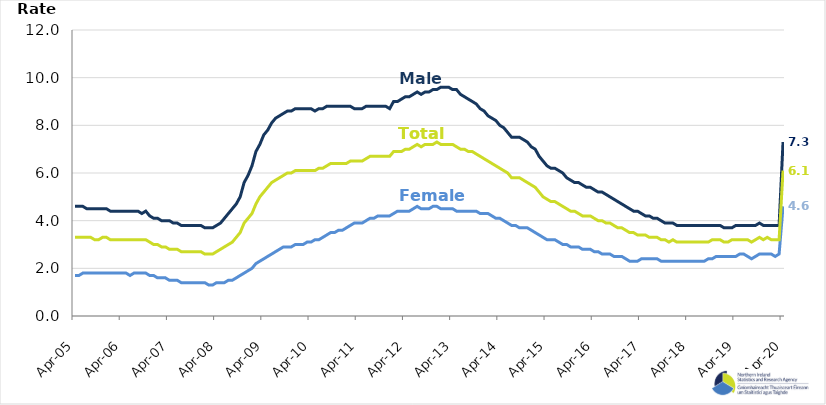
| Category | Male | Female | Total |
|---|---|---|---|
| 2005-04-01 | 4.6 | 1.7 | 3.3 |
| 2005-05-01 | 4.6 | 1.7 | 3.3 |
| 2005-06-01 | 4.6 | 1.8 | 3.3 |
| 2005-07-01 | 4.5 | 1.8 | 3.3 |
| 2005-08-01 | 4.5 | 1.8 | 3.3 |
| 2005-09-01 | 4.5 | 1.8 | 3.2 |
| 2005-10-01 | 4.5 | 1.8 | 3.2 |
| 2005-11-01 | 4.5 | 1.8 | 3.3 |
| 2005-12-01 | 4.5 | 1.8 | 3.3 |
| 2006-01-01 | 4.4 | 1.8 | 3.2 |
| 2006-02-01 | 4.4 | 1.8 | 3.2 |
| 2006-03-01 | 4.4 | 1.8 | 3.2 |
| 2006-04-01 | 4.4 | 1.8 | 3.2 |
| 2006-05-01 | 4.4 | 1.8 | 3.2 |
| 2006-06-01 | 4.4 | 1.7 | 3.2 |
| 2006-07-01 | 4.4 | 1.8 | 3.2 |
| 2006-08-01 | 4.4 | 1.8 | 3.2 |
| 2006-09-01 | 4.3 | 1.8 | 3.2 |
| 2006-10-01 | 4.4 | 1.8 | 3.2 |
| 2006-11-01 | 4.2 | 1.7 | 3.1 |
| 2006-12-01 | 4.1 | 1.7 | 3 |
| 2007-01-01 | 4.1 | 1.6 | 3 |
| 2007-02-01 | 4 | 1.6 | 2.9 |
| 2007-03-01 | 4 | 1.6 | 2.9 |
| 2007-04-01 | 4 | 1.5 | 2.8 |
| 2007-05-01 | 3.9 | 1.5 | 2.8 |
| 2007-06-01 | 3.9 | 1.5 | 2.8 |
| 2007-07-01 | 3.8 | 1.4 | 2.7 |
| 2007-08-01 | 3.8 | 1.4 | 2.7 |
| 2007-09-01 | 3.8 | 1.4 | 2.7 |
| 2007-10-01 | 3.8 | 1.4 | 2.7 |
| 2007-11-01 | 3.8 | 1.4 | 2.7 |
| 2007-12-01 | 3.8 | 1.4 | 2.7 |
| 2008-01-01 | 3.7 | 1.4 | 2.6 |
| 2008-02-01 | 3.7 | 1.3 | 2.6 |
| 2008-03-01 | 3.7 | 1.3 | 2.6 |
| 2008-04-01 | 3.8 | 1.4 | 2.7 |
| 2008-05-01 | 3.9 | 1.4 | 2.8 |
| 2008-06-01 | 4.1 | 1.4 | 2.9 |
| 2008-07-01 | 4.3 | 1.5 | 3 |
| 2008-08-01 | 4.5 | 1.5 | 3.1 |
| 2008-09-01 | 4.7 | 1.6 | 3.3 |
| 2008-10-01 | 5 | 1.7 | 3.5 |
| 2008-11-01 | 5.6 | 1.8 | 3.9 |
| 2008-12-01 | 5.9 | 1.9 | 4.1 |
| 2009-01-01 | 6.3 | 2 | 4.3 |
| 2009-02-01 | 6.9 | 2.2 | 4.7 |
| 2009-03-01 | 7.2 | 2.3 | 5 |
| 2009-04-01 | 7.6 | 2.4 | 5.2 |
| 2009-05-01 | 7.8 | 2.5 | 5.4 |
| 2009-06-01 | 8.1 | 2.6 | 5.6 |
| 2009-07-01 | 8.3 | 2.7 | 5.7 |
| 2009-08-01 | 8.4 | 2.8 | 5.8 |
| 2009-09-01 | 8.5 | 2.9 | 5.9 |
| 2009-10-01 | 8.6 | 2.9 | 6 |
| 2009-11-01 | 8.6 | 2.9 | 6 |
| 2009-12-01 | 8.7 | 3 | 6.1 |
| 2010-01-01 | 8.7 | 3 | 6.1 |
| 2010-02-01 | 8.7 | 3 | 6.1 |
| 2010-03-01 | 8.7 | 3.1 | 6.1 |
| 2010-04-01 | 8.7 | 3.1 | 6.1 |
| 2010-05-01 | 8.6 | 3.2 | 6.1 |
| 2010-06-01 | 8.7 | 3.2 | 6.2 |
| 2010-07-01 | 8.7 | 3.3 | 6.2 |
| 2010-08-01 | 8.8 | 3.4 | 6.3 |
| 2010-09-01 | 8.8 | 3.5 | 6.4 |
| 2010-10-01 | 8.8 | 3.5 | 6.4 |
| 2010-11-01 | 8.8 | 3.6 | 6.4 |
| 2010-12-01 | 8.8 | 3.6 | 6.4 |
| 2011-01-01 | 8.8 | 3.7 | 6.4 |
| 2011-02-01 | 8.8 | 3.8 | 6.5 |
| 2011-03-01 | 8.7 | 3.9 | 6.5 |
| 2011-04-01 | 8.7 | 3.9 | 6.5 |
| 2011-05-01 | 8.7 | 3.9 | 6.5 |
| 2011-06-01 | 8.8 | 4 | 6.6 |
| 2011-07-01 | 8.8 | 4.1 | 6.7 |
| 2011-08-01 | 8.8 | 4.1 | 6.7 |
| 2011-09-01 | 8.8 | 4.2 | 6.7 |
| 2011-10-01 | 8.8 | 4.2 | 6.7 |
| 2011-11-01 | 8.8 | 4.2 | 6.7 |
| 2011-12-01 | 8.7 | 4.2 | 6.7 |
| 2012-01-01 | 9 | 4.3 | 6.9 |
| 2012-02-01 | 9 | 4.4 | 6.9 |
| 2012-03-01 | 9.1 | 4.4 | 6.9 |
| 2012-04-01 | 9.2 | 4.4 | 7 |
| 2012-05-01 | 9.2 | 4.4 | 7 |
| 2012-06-01 | 9.3 | 4.5 | 7.1 |
| 2012-07-01 | 9.4 | 4.6 | 7.2 |
| 2012-08-01 | 9.3 | 4.5 | 7.1 |
| 2012-09-01 | 9.4 | 4.5 | 7.2 |
| 2012-10-01 | 9.4 | 4.5 | 7.2 |
| 2012-11-01 | 9.5 | 4.6 | 7.2 |
| 2012-12-01 | 9.5 | 4.6 | 7.3 |
| 2013-01-01 | 9.6 | 4.5 | 7.2 |
| 2013-02-01 | 9.6 | 4.5 | 7.2 |
| 2013-03-01 | 9.6 | 4.5 | 7.2 |
| 2013-04-01 | 9.5 | 4.5 | 7.2 |
| 2013-05-01 | 9.5 | 4.4 | 7.1 |
| 2013-06-01 | 9.3 | 4.4 | 7 |
| 2013-07-01 | 9.2 | 4.4 | 7 |
| 2013-08-01 | 9.1 | 4.4 | 6.9 |
| 2013-09-01 | 9 | 4.4 | 6.9 |
| 2013-10-01 | 8.9 | 4.4 | 6.8 |
| 2013-11-01 | 8.7 | 4.3 | 6.7 |
| 2013-12-01 | 8.6 | 4.3 | 6.6 |
| 2014-01-01 | 8.4 | 4.3 | 6.5 |
| 2014-02-01 | 8.3 | 4.2 | 6.4 |
| 2014-03-01 | 8.2 | 4.1 | 6.3 |
| 2014-04-01 | 8 | 4.1 | 6.2 |
| 2014-05-01 | 7.9 | 4 | 6.1 |
| 2014-06-01 | 7.7 | 3.9 | 6 |
| 2014-07-01 | 7.5 | 3.8 | 5.8 |
| 2014-08-01 | 7.5 | 3.8 | 5.8 |
| 2014-09-01 | 7.5 | 3.7 | 5.8 |
| 2014-10-01 | 7.4 | 3.7 | 5.7 |
| 2014-11-01 | 7.3 | 3.7 | 5.6 |
| 2014-12-01 | 7.1 | 3.6 | 5.5 |
| 2015-01-01 | 7 | 3.5 | 5.4 |
| 2015-02-01 | 6.7 | 3.4 | 5.2 |
| 2015-03-01 | 6.5 | 3.3 | 5 |
| 2015-04-01 | 6.3 | 3.2 | 4.9 |
| 2015-05-01 | 6.2 | 3.2 | 4.8 |
| 2015-06-01 | 6.2 | 3.2 | 4.8 |
| 2015-07-01 | 6.1 | 3.1 | 4.7 |
| 2015-08-01 | 6 | 3 | 4.6 |
| 2015-09-01 | 5.8 | 3 | 4.5 |
| 2015-10-01 | 5.7 | 2.9 | 4.4 |
| 2015-11-01 | 5.6 | 2.9 | 4.4 |
| 2015-12-01 | 5.6 | 2.9 | 4.3 |
| 2016-01-01 | 5.5 | 2.8 | 4.2 |
| 2016-02-01 | 5.4 | 2.8 | 4.2 |
| 2016-03-01 | 5.4 | 2.8 | 4.2 |
| 2016-04-01 | 5.3 | 2.7 | 4.1 |
| 2016-05-01 | 5.2 | 2.7 | 4 |
| 2016-06-01 | 5.2 | 2.6 | 4 |
| 2016-07-01 | 5.1 | 2.6 | 3.9 |
| 2016-08-01 | 5 | 2.6 | 3.9 |
| 2016-09-01 | 4.9 | 2.5 | 3.8 |
| 2016-10-01 | 4.8 | 2.5 | 3.7 |
| 2016-11-01 | 4.7 | 2.5 | 3.7 |
| 2016-12-01 | 4.6 | 2.4 | 3.6 |
| 2017-01-01 | 4.5 | 2.3 | 3.5 |
| 2017-02-01 | 4.4 | 2.3 | 3.5 |
| 2017-03-01 | 4.4 | 2.3 | 3.4 |
| 2017-04-01 | 4.3 | 2.4 | 3.4 |
| 2017-05-01 | 4.2 | 2.4 | 3.4 |
| 2017-06-01 | 4.2 | 2.4 | 3.3 |
| 2017-07-01 | 4.1 | 2.4 | 3.3 |
| 2017-08-01 | 4.1 | 2.4 | 3.3 |
| 2017-09-01 | 4 | 2.3 | 3.2 |
| 2017-10-01 | 3.9 | 2.3 | 3.2 |
| 2017-11-01 | 3.9 | 2.3 | 3.1 |
| 2017-12-01 | 3.9 | 2.3 | 3.2 |
| 2018-01-01 | 3.8 | 2.3 | 3.1 |
| 2018-02-01 | 3.8 | 2.3 | 3.1 |
| 2018-03-01 | 3.8 | 2.3 | 3.1 |
| 2018-04-01 | 3.8 | 2.3 | 3.1 |
| 2018-05-01 | 3.8 | 2.3 | 3.1 |
| 2018-06-01 | 3.8 | 2.3 | 3.1 |
| 2018-07-01 | 3.8 | 2.3 | 3.1 |
| 2018-08-01 | 3.8 | 2.3 | 3.1 |
| 2018-09-01 | 3.8 | 2.4 | 3.1 |
| 2018-10-01 | 3.8 | 2.4 | 3.2 |
| 2018-11-01 | 3.8 | 2.5 | 3.2 |
| 2018-12-01 | 3.8 | 2.5 | 3.2 |
| 2019-01-01 | 3.7 | 2.5 | 3.1 |
| 2019-02-01 | 3.7 | 2.5 | 3.1 |
| 2019-03-01 | 3.7 | 2.5 | 3.2 |
| 2019-04-01 | 3.8 | 2.5 | 3.2 |
| 2019-05-01 | 3.8 | 2.6 | 3.2 |
| 2019-06-01 | 3.8 | 2.6 | 3.2 |
| 2019-07-01 | 3.8 | 2.5 | 3.2 |
| 2019-08-01 | 3.8 | 2.4 | 3.1 |
| 2019-09-01 | 3.8 | 2.5 | 3.2 |
| 2019-10-01 | 3.9 | 2.6 | 3.3 |
| 2019-11-01 | 3.8 | 2.6 | 3.2 |
| 2019-12-01 | 3.8 | 2.6 | 3.3 |
| 2020-01-01 | 3.8 | 2.6 | 3.2 |
| 2020-02-01 | 3.8 | 2.5 | 3.2 |
| 2020-03-01 | 3.8 | 2.6 | 3.2 |
| 2020-04-01 | 7.3 | 4.6 | 6.1 |